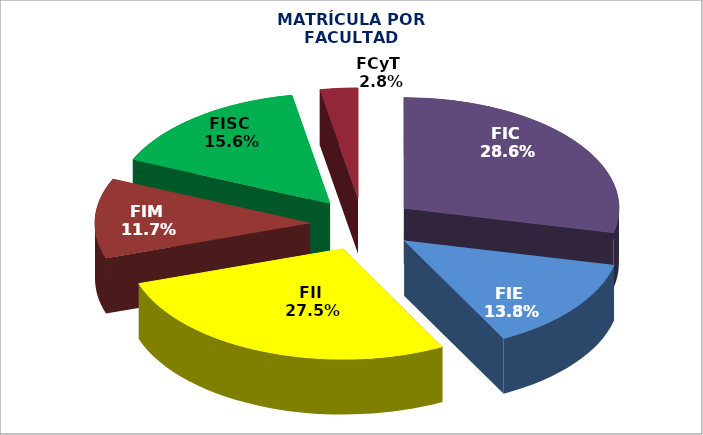
| Category | Series 0 |
|---|---|
| 0 | 28.571 |
| 1 | 13.786 |
| 2 | 27.527 |
| 3 | 11.659 |
| 4 | 15.619 |
| 5 | 2.838 |